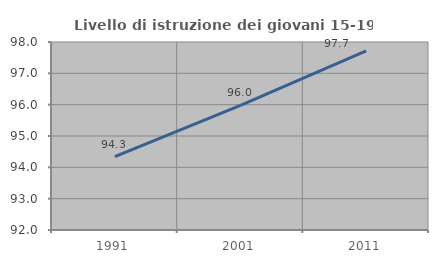
| Category | Livello di istruzione dei giovani 15-19 anni |
|---|---|
| 1991.0 | 94.34 |
| 2001.0 | 95.977 |
| 2011.0 | 97.714 |